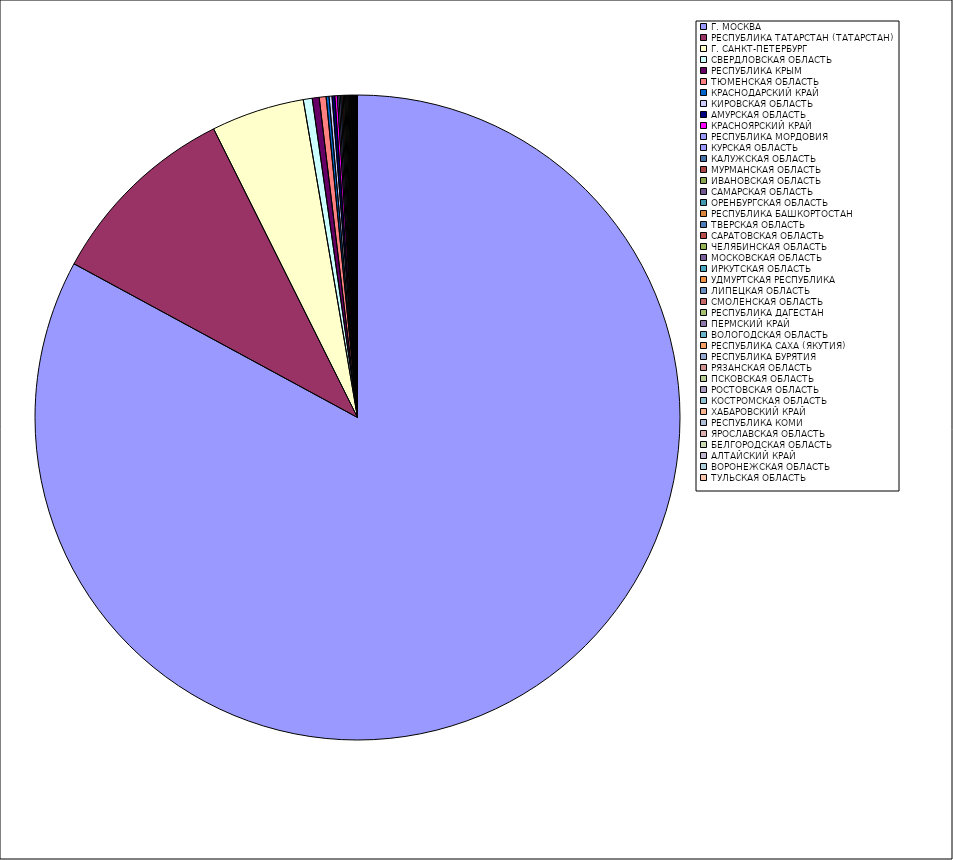
| Category | Оборот |
|---|---|
| Г. МОСКВА | 82.887 |
| РЕСПУБЛИКА ТАТАРСТАН (ТАТАРСТАН) | 9.732 |
| Г. САНКТ-ПЕТЕРБУРГ | 4.666 |
| СВЕРДЛОВСКАЯ ОБЛАСТЬ | 0.448 |
| РЕСПУБЛИКА КРЫМ | 0.347 |
| ТЮМЕНСКАЯ ОБЛАСТЬ | 0.343 |
| КРАСНОДАРСКИЙ КРАЙ | 0.148 |
| КИРОВСКАЯ ОБЛАСТЬ | 0.147 |
| АМУРСКАЯ ОБЛАСТЬ | 0.137 |
| КРАСНОЯРСКИЙ КРАЙ | 0.127 |
| РЕСПУБЛИКА МОРДОВИЯ | 0.078 |
| КУРСКАЯ ОБЛАСТЬ | 0.077 |
| КАЛУЖСКАЯ ОБЛАСТЬ | 0.07 |
| МУРМАНСКАЯ ОБЛАСТЬ | 0.066 |
| ИВАНОВСКАЯ ОБЛАСТЬ | 0.061 |
| САМАРСКАЯ ОБЛАСТЬ | 0.056 |
| ОРЕНБУРГСКАЯ ОБЛАСТЬ | 0.055 |
| РЕСПУБЛИКА БАШКОРТОСТАН | 0.053 |
| ТВЕРСКАЯ ОБЛАСТЬ | 0.047 |
| САРАТОВСКАЯ ОБЛАСТЬ | 0.045 |
| ЧЕЛЯБИНСКАЯ ОБЛАСТЬ | 0.038 |
| МОСКОВСКАЯ ОБЛАСТЬ | 0.038 |
| ИРКУТСКАЯ ОБЛАСТЬ | 0.036 |
| УДМУРТСКАЯ РЕСПУБЛИКА | 0.035 |
| ЛИПЕЦКАЯ ОБЛАСТЬ | 0.031 |
| СМОЛЕНСКАЯ ОБЛАСТЬ | 0.021 |
| РЕСПУБЛИКА ДАГЕСТАН | 0.02 |
| ПЕРМСКИЙ КРАЙ | 0.018 |
| ВОЛОГОДСКАЯ ОБЛАСТЬ | 0.016 |
| РЕСПУБЛИКА САХА (ЯКУТИЯ) | 0.016 |
| РЕСПУБЛИКА БУРЯТИЯ | 0.015 |
| РЯЗАНСКАЯ ОБЛАСТЬ | 0.014 |
| ПСКОВСКАЯ ОБЛАСТЬ | 0.012 |
| РОСТОВСКАЯ ОБЛАСТЬ | 0.011 |
| КОСТРОМСКАЯ ОБЛАСТЬ | 0.011 |
| ХАБАРОВСКИЙ КРАЙ | 0.01 |
| РЕСПУБЛИКА КОМИ | 0.009 |
| ЯРОСЛАВСКАЯ ОБЛАСТЬ | 0.009 |
| БЕЛГОРОДСКАЯ ОБЛАСТЬ | 0.008 |
| АЛТАЙСКИЙ КРАЙ | 0.007 |
| ВОРОНЕЖСКАЯ ОБЛАСТЬ | 0.006 |
| ТУЛЬСКАЯ ОБЛАСТЬ | 0.005 |